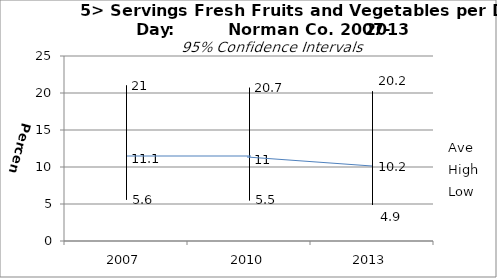
| Category | Ave | High | Low |
|---|---|---|---|
| 2007.0 | 11.1 | 21 | 5.6 |
| 2010.0 | 11 | 20.7 | 5.5 |
| 2013.0 | 10.2 | 20.2 | 4.9 |